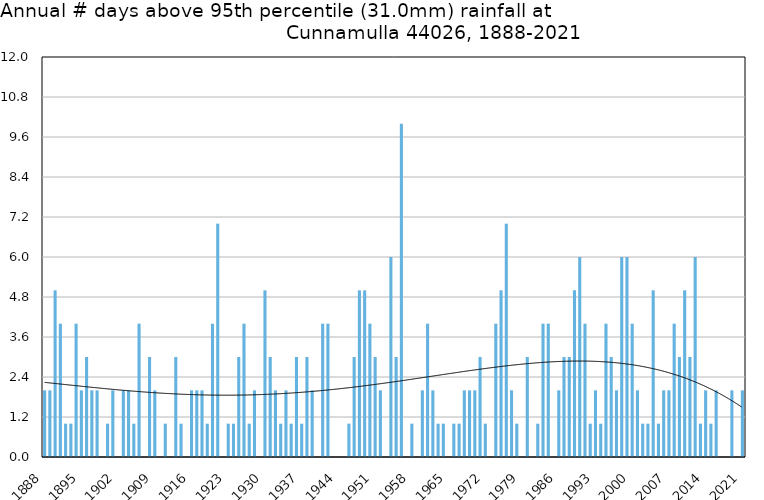
| Category | Annual # days above 95th percentile |
|---|---|
| 1888 | 2 |
| 1889 | 2 |
| 1890 | 5 |
| 1891 | 4 |
| 1892 | 1 |
| 1893 | 1 |
| 1894 | 4 |
| 1895 | 2 |
| 1896 | 3 |
| 1897 | 2 |
| 1898 | 2 |
| 1899 | 0 |
| 1900 | 1 |
| 1901 | 2 |
| 1902 | 0 |
| 1903 | 2 |
| 1904 | 2 |
| 1905 | 1 |
| 1906 | 4 |
| 1907 | 0 |
| 1908 | 3 |
| 1909 | 2 |
| 1910 | 0 |
| 1911 | 1 |
| 1912 | 0 |
| 1913 | 3 |
| 1914 | 1 |
| 1915 | 0 |
| 1916 | 2 |
| 1917 | 2 |
| 1918 | 2 |
| 1919 | 1 |
| 1920 | 4 |
| 1921 | 7 |
| 1922 | 0 |
| 1923 | 1 |
| 1924 | 1 |
| 1925 | 3 |
| 1926 | 4 |
| 1927 | 1 |
| 1928 | 2 |
| 1929 | 0 |
| 1930 | 5 |
| 1931 | 3 |
| 1932 | 2 |
| 1933 | 1 |
| 1934 | 2 |
| 1935 | 1 |
| 1936 | 3 |
| 1937 | 1 |
| 1938 | 3 |
| 1939 | 2 |
| 1940 | 0 |
| 1941 | 4 |
| 1942 | 4 |
| 1943 | 0 |
| 1944 | 0 |
| 1945 | 0 |
| 1946 | 1 |
| 1947 | 3 |
| 1948 | 5 |
| 1949 | 5 |
| 1950 | 4 |
| 1951 | 3 |
| 1952 | 2 |
| 1953 | 0 |
| 1954 | 6 |
| 1955 | 3 |
| 1956 | 10 |
| 1957 | 0 |
| 1958 | 1 |
| 1959 | 0 |
| 1960 | 2 |
| 1961 | 4 |
| 1962 | 2 |
| 1963 | 1 |
| 1964 | 1 |
| 1965 | 0 |
| 1966 | 1 |
| 1967 | 1 |
| 1968 | 2 |
| 1969 | 2 |
| 1970 | 2 |
| 1971 | 3 |
| 1972 | 1 |
| 1973 | 0 |
| 1974 | 4 |
| 1975 | 5 |
| 1976 | 7 |
| 1977 | 2 |
| 1978 | 1 |
| 1979 | 0 |
| 1980 | 3 |
| 1981 | 0 |
| 1982 | 1 |
| 1983 | 4 |
| 1984 | 4 |
| 1985 | 0 |
| 1986 | 2 |
| 1987 | 3 |
| 1988 | 3 |
| 1989 | 5 |
| 1990 | 6 |
| 1991 | 4 |
| 1992 | 1 |
| 1993 | 2 |
| 1994 | 1 |
| 1995 | 4 |
| 1996 | 3 |
| 1997 | 2 |
| 1998 | 6 |
| 1999 | 6 |
| 2000 | 4 |
| 2001 | 2 |
| 2002 | 1 |
| 2003 | 1 |
| 2004 | 5 |
| 2005 | 1 |
| 2006 | 2 |
| 2007 | 2 |
| 2008 | 4 |
| 2009 | 3 |
| 2010 | 5 |
| 2011 | 3 |
| 2012 | 6 |
| 2013 | 1 |
| 2014 | 2 |
| 2015 | 1 |
| 2016 | 2 |
| 2017 | 0 |
| 2018 | 0 |
| 2019 | 2 |
| 2020 | 0 |
| 2021 | 2 |